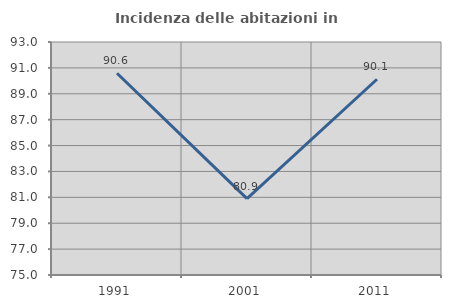
| Category | Incidenza delle abitazioni in proprietà  |
|---|---|
| 1991.0 | 90.588 |
| 2001.0 | 80.899 |
| 2011.0 | 90.123 |